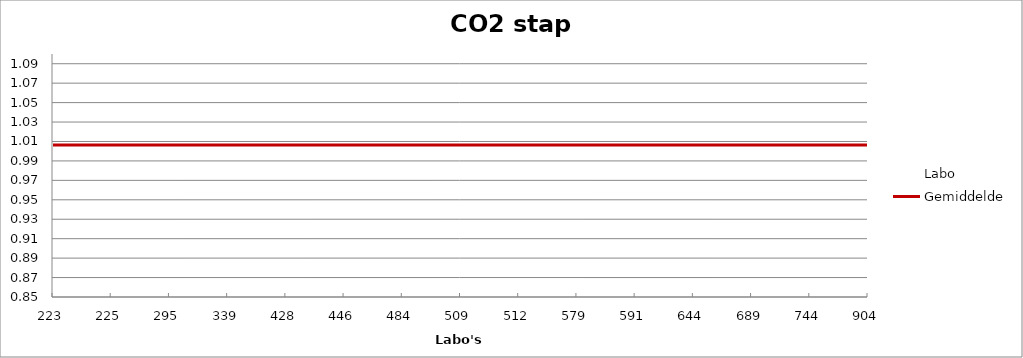
| Category | Labo | Gemiddelde |
|---|---|---|
| 223.0 | 0.993 | 1.006 |
| 225.0 | 1.001 | 1.006 |
| 295.0 | 1.003 | 1.006 |
| 339.0 | 1.05 | 1.006 |
| 428.0 | 1.006 | 1.006 |
| 446.0 | 1.011 | 1.006 |
| 484.0 | 0.89 | 1.006 |
| 509.0 | 1.018 | 1.006 |
| 512.0 | 0.969 | 1.006 |
| 579.0 | 1.003 | 1.006 |
| 591.0 | 1.009 | 1.006 |
| 644.0 | 1.061 | 1.006 |
| 689.0 | 1.021 | 1.006 |
| 744.0 | 0.966 | 1.006 |
| 904.0 | 1.035 | 1.006 |